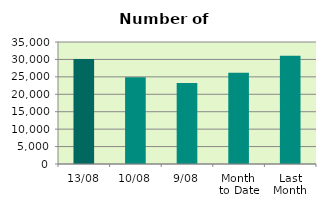
| Category | Series 0 |
|---|---|
| 13/08 | 30110 |
| 10/08 | 24894 |
| 9/08 | 23222 |
| Month 
to Date | 26188.889 |
| Last
Month | 31061.545 |